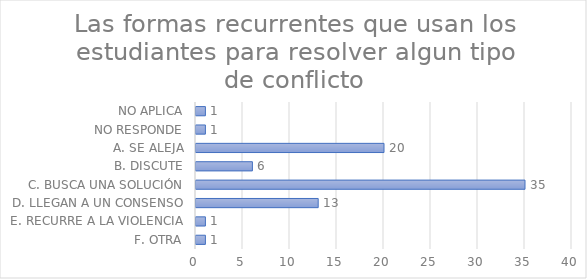
| Category | Series 0 |
|---|---|
| F. OTRA | 1 |
| E. RECURRE A LA VIOLENCIA | 1 |
| D. LLEGAN A UN CONSENSO | 13 |
| C. BUSCA UNA SOLUCIÓN | 35 |
| B. DISCUTE | 6 |
| A. SE ALEJA | 20 |
| NO RESPONDE | 1 |
| NO APLICA | 1 |